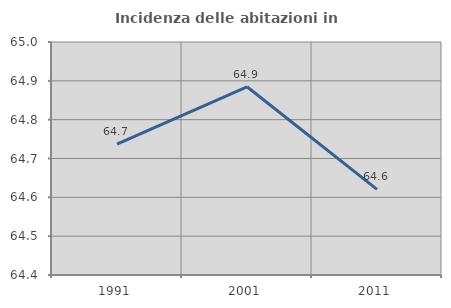
| Category | Incidenza delle abitazioni in proprietà  |
|---|---|
| 1991.0 | 64.737 |
| 2001.0 | 64.885 |
| 2011.0 | 64.621 |